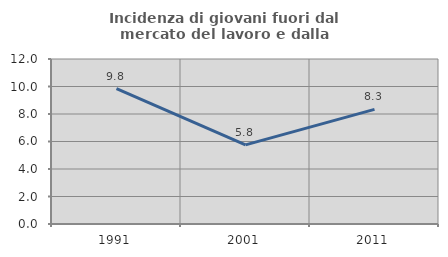
| Category | Incidenza di giovani fuori dal mercato del lavoro e dalla formazione  |
|---|---|
| 1991.0 | 9.845 |
| 2001.0 | 5.755 |
| 2011.0 | 8.333 |